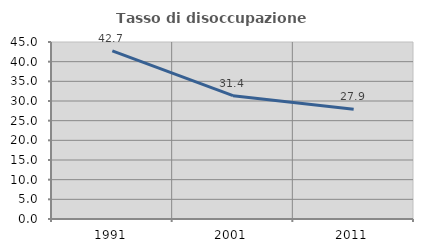
| Category | Tasso di disoccupazione giovanile  |
|---|---|
| 1991.0 | 42.733 |
| 2001.0 | 31.358 |
| 2011.0 | 27.911 |